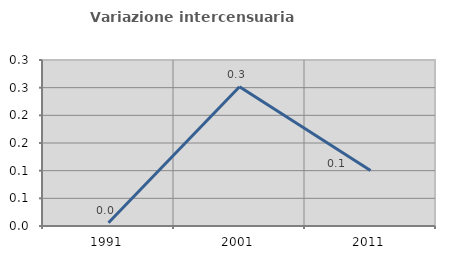
| Category | Variazione intercensuaria annua |
|---|---|
| 1991.0 | 0.006 |
| 2001.0 | 0.252 |
| 2011.0 | 0.1 |